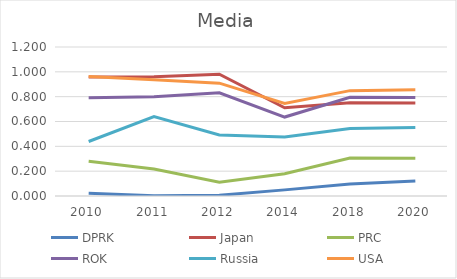
| Category | DPRK  | Japan  | PRC  | ROK  | Russia  | USA  |
|---|---|---|---|---|---|---|
| 2010.0 | 0.021 | 0.957 | 0.28 | 0.792 | 0.439 | 0.962 |
| 2011.0 | 0.002 | 0.961 | 0.218 | 0.799 | 0.64 | 0.937 |
| 2012.0 | 0.006 | 0.981 | 0.111 | 0.832 | 0.492 | 0.909 |
| 2014.0 | 0.049 | 0.71 | 0.179 | 0.636 | 0.474 | 0.745 |
| 2018.0 | 0.096 | 0.751 | 0.305 | 0.795 | 0.543 | 0.848 |
| 2020.0 | 0.121 | 0.749 | 0.304 | 0.793 | 0.552 | 0.856 |